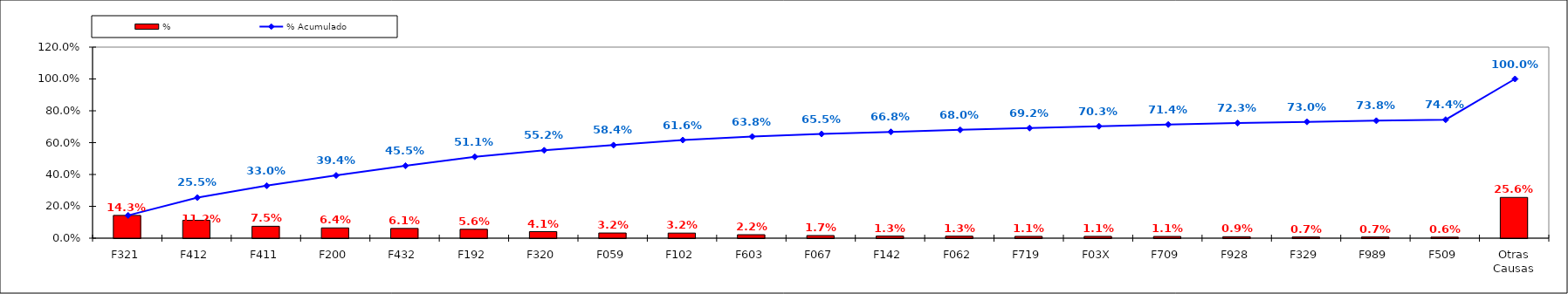
| Category | % |
|---|---|
| F321 | 0.143 |
| F412 | 0.112 |
| F411 | 0.075 |
| F200 | 0.064 |
| F432 | 0.061 |
| F192 | 0.056 |
| F320 | 0.041 |
| F059 | 0.032 |
| F102 | 0.032 |
| F603 | 0.022 |
| F067 | 0.017 |
| F142 | 0.013 |
| F062 | 0.013 |
| F719 | 0.011 |
| F03X | 0.011 |
| F709 | 0.011 |
| F928 | 0.009 |
| F329 | 0.007 |
| F989 | 0.007 |
| F509 | 0.006 |
| Otras Causas | 0.256 |